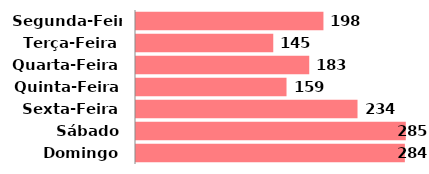
| Category | Qtde |
|---|---|
| Segunda-Feira | 198 |
| Terça-Feira | 145 |
| Quarta-Feira | 183 |
| Quinta-Feira | 159 |
| Sexta-Feira | 234 |
| Sábado | 285 |
| Domingo | 284 |